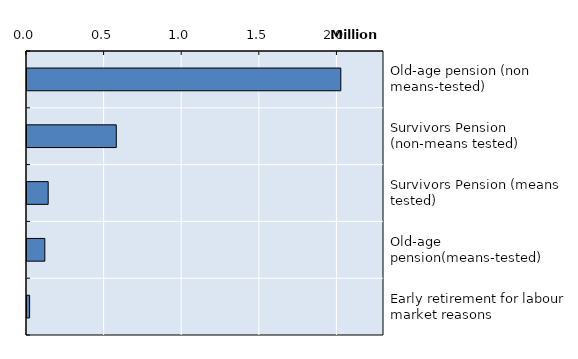
| Category | Series 0 |
|---|---|
| Old-age pension (non means-tested) | 2021744 |
| Survivors Pension (non-means tested) | 575236 |
| Survivors Pension (means tested) | 136423 |
| Old-age pension(means-tested) | 114848 |
| Early retirement for labour market reasons | 16862 |